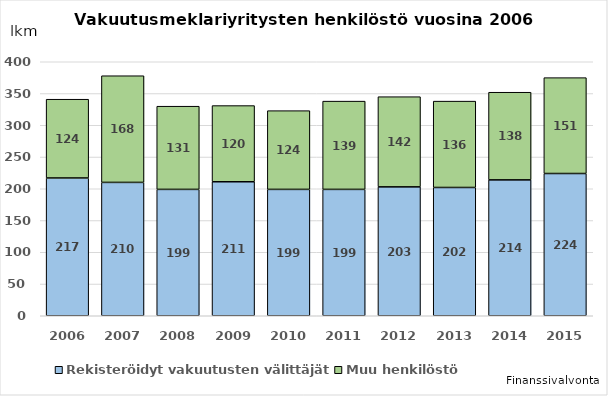
| Category | Rekisteröidyt vakuutusten välittäjät  | Muu henkilöstö |
|---|---|---|
| 2006.0 | 217 | 124 |
| 2007.0 | 210 | 168 |
| 2008.0 | 199 | 131 |
| 2009.0 | 211 | 120 |
| 2010.0 | 199 | 124 |
| 2011.0 | 199 | 139 |
| 2012.0 | 203 | 142 |
| 2013.0 | 202 | 136 |
| 2014.0 | 214 | 138 |
| 2015.0 | 224 | 151 |